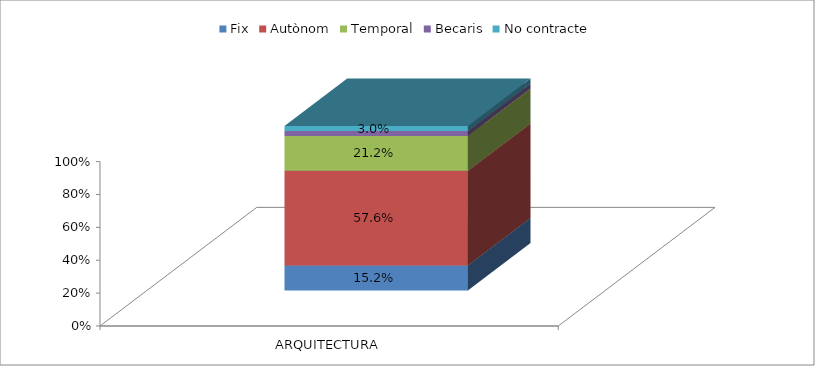
| Category | Fix | Autònom | Temporal | Becaris | No contracte |
|---|---|---|---|---|---|
| ARQUITECTURA | 0.152 | 0.576 | 0.212 | 0.03 | 0.03 |